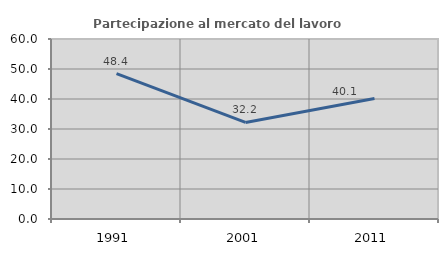
| Category | Partecipazione al mercato del lavoro  femminile |
|---|---|
| 1991.0 | 48.43 |
| 2001.0 | 32.2 |
| 2011.0 | 40.136 |